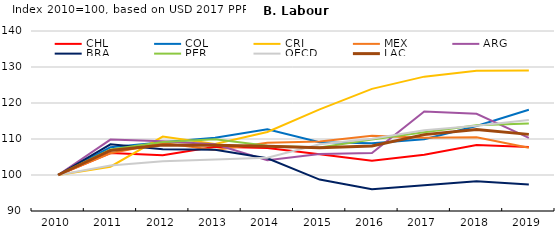
| Category | CHL | COL | CRI | MEX | ARG | BRA | PER | OECD | LAC |
|---|---|---|---|---|---|---|---|---|---|
| 2010.0 | 100 | 100 | 100 | 100 | 100 | 100 | 100 | 100 | 100 |
| 2011.0 | 106.096 | 107.709 | 102.312 | 106.029 | 109.835 | 108.515 | 107.095 | 102.65 | 106.814 |
| 2012.0 | 105.51 | 109.13 | 110.667 | 108.915 | 109.384 | 107.162 | 109.15 | 103.831 | 108.345 |
| 2013.0 | 107.849 | 110.362 | 108.642 | 106.97 | 108.533 | 107.008 | 109.905 | 104.276 | 108.262 |
| 2014.0 | 107.532 | 112.686 | 111.954 | 108.983 | 104.107 | 104.659 | 108.158 | 104.817 | 108 |
| 2015.0 | 105.775 | 109.081 | 118.226 | 109.336 | 105.817 | 98.723 | 107.658 | 108.518 | 107.593 |
| 2016.0 | 103.935 | 108.814 | 123.931 | 110.875 | 106.116 | 96.022 | 109.83 | 110.093 | 108.069 |
| 2017.0 | 105.621 | 109.957 | 127.322 | 110.382 | 117.626 | 97.169 | 111.857 | 112.451 | 111.214 |
| 2018.0 | 108.329 | 113.62 | 128.974 | 110.473 | 117.003 | 98.294 | 113.834 | 113.666 | 112.607 |
| 2019.0 | 107.808 | 118.111 | 129.017 | 107.585 | 110.317 | 97.336 | 114.326 | 115.268 | 111.283 |